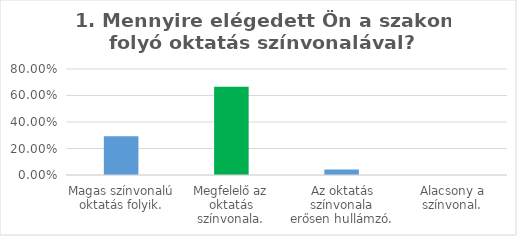
| Category | Series 0 |
|---|---|
| Magas színvonalú oktatás folyik. | 0.292 |
| Megfelelő az oktatás színvonala. | 0.667 |
| Az oktatás színvonala erősen hullámzó. | 0.042 |
| Alacsony a színvonal. | 0 |